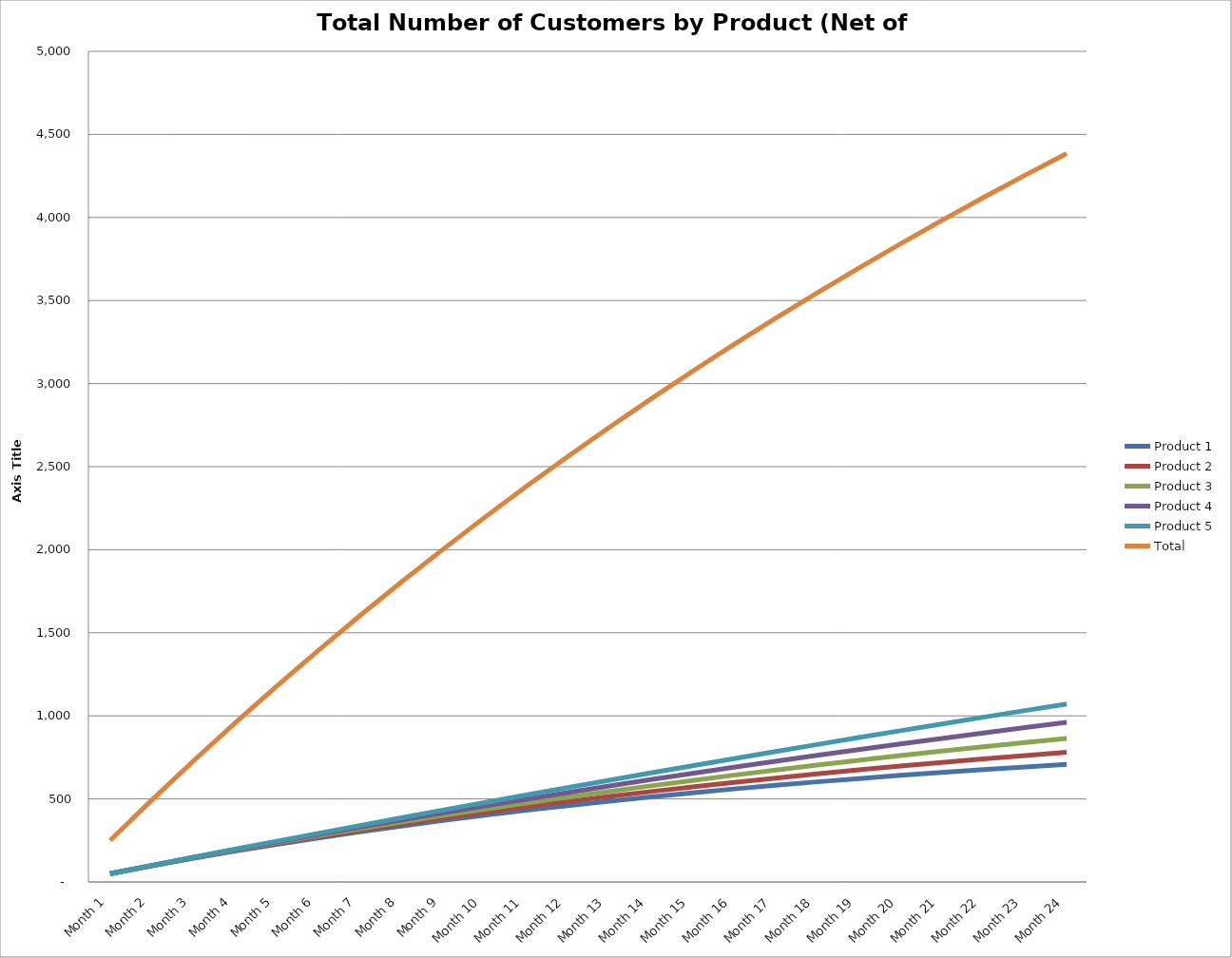
| Category | Product 1 | Product 2 | Product 3 | Product 4 | Product 5 | Total |
|---|---|---|---|---|---|---|
| Month 1 | 50 | 50 | 50 | 50 | 50 | 250 |
| Month 2 | 97.5 | 98 | 98.5 | 99 | 99.5 | 492.5 |
| Month 3 | 142.625 | 144.08 | 145.545 | 147.02 | 148.505 | 727.775 |
| Month 4 | 185.494 | 188.317 | 191.179 | 194.08 | 197.02 | 956.089 |
| Month 5 | 226.219 | 230.784 | 235.443 | 240.198 | 245.05 | 1177.694 |
| Month 6 | 264.908 | 271.553 | 278.38 | 285.394 | 292.599 | 1392.834 |
| Month 7 | 301.663 | 310.691 | 320.029 | 329.686 | 339.673 | 1601.741 |
| Month 8 | 336.58 | 348.263 | 360.428 | 373.092 | 386.277 | 1804.639 |
| Month 9 | 369.751 | 384.333 | 399.615 | 415.631 | 432.414 | 2001.742 |
| Month 10 | 401.263 | 418.959 | 437.626 | 457.318 | 478.09 | 2193.256 |
| Month 11 | 431.2 | 452.201 | 474.498 | 498.172 | 523.309 | 2379.379 |
| Month 12 | 459.64 | 484.113 | 510.263 | 538.208 | 568.076 | 2560.299 |
| Month 13 | 486.658 | 514.748 | 544.955 | 577.444 | 612.395 | 2736.2 |
| Month 14 | 512.325 | 544.158 | 578.606 | 615.895 | 656.271 | 2907.256 |
| Month 15 | 536.709 | 572.392 | 611.248 | 653.577 | 699.708 | 3073.634 |
| Month 16 | 559.873 | 599.496 | 642.911 | 690.506 | 742.711 | 3235.497 |
| Month 17 | 581.88 | 625.516 | 673.623 | 726.696 | 785.284 | 3392.999 |
| Month 18 | 602.786 | 650.496 | 703.415 | 762.162 | 827.431 | 3546.289 |
| Month 19 | 622.646 | 674.476 | 732.312 | 796.918 | 869.157 | 3695.51 |
| Month 20 | 641.514 | 697.497 | 760.343 | 830.98 | 910.465 | 3840.799 |
| Month 21 | 659.438 | 719.597 | 787.532 | 864.36 | 951.361 | 3982.289 |
| Month 22 | 676.466 | 740.813 | 813.907 | 897.073 | 991.847 | 4120.106 |
| Month 23 | 692.643 | 761.181 | 839.489 | 929.132 | 1031.929 | 4254.373 |
| Month 24 | 708.011 | 780.733 | 864.305 | 960.549 | 1071.609 | 4385.208 |